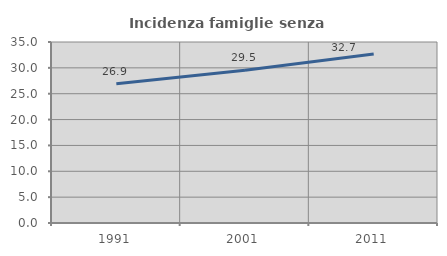
| Category | Incidenza famiglie senza nuclei |
|---|---|
| 1991.0 | 26.939 |
| 2001.0 | 29.542 |
| 2011.0 | 32.662 |